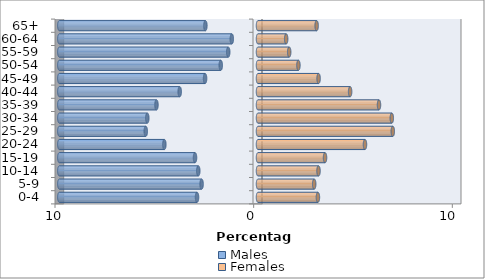
| Category | Males | Females |
|---|---|---|
| 0-4 | -3.069 | 3.016 |
| 5-9 | -2.839 | 2.829 |
| 10-14 | -3.006 | 3.046 |
| 15-19 | -3.17 | 3.374 |
| 20-24 | -4.714 | 5.385 |
| 25-29 | -5.649 | 6.785 |
| 30-34 | -5.573 | 6.735 |
| 35-39 | -5.111 | 6.09 |
| 40-44 | -3.941 | 4.637 |
| 45-49 | -2.664 | 3.05 |
| 50-54 | -1.875 | 2.035 |
| 55-59 | -1.499 | 1.57 |
| 60-64 | -1.319 | 1.418 |
| 65+ | -2.648 | 2.952 |